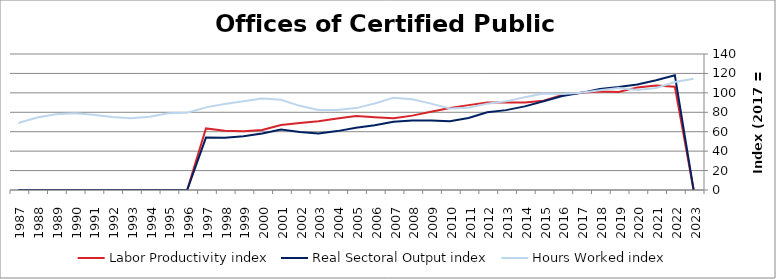
| Category | Labor Productivity index | Real Sectoral Output index | Hours Worked index |
|---|---|---|---|
| 2023.0 | 0 | 0 | 114.622 |
| 2022.0 | 106.226 | 118.014 | 111.097 |
| 2021.0 | 107.583 | 113.073 | 105.103 |
| 2020.0 | 105.625 | 108.632 | 102.847 |
| 2019.0 | 100.869 | 106.018 | 105.105 |
| 2018.0 | 101.414 | 104.084 | 102.633 |
| 2017.0 | 100 | 100 | 100 |
| 2016.0 | 97.776 | 96.698 | 98.898 |
| 2015.0 | 91.965 | 91.276 | 99.251 |
| 2014.0 | 90.201 | 86.068 | 95.418 |
| 2013.0 | 90.118 | 82.226 | 91.242 |
| 2012.0 | 90.015 | 80.028 | 88.905 |
| 2011.0 | 87.364 | 74.038 | 84.747 |
| 2010.0 | 84.441 | 70.793 | 83.837 |
| 2009.0 | 80.536 | 71.606 | 88.913 |
| 2008.0 | 76.549 | 71.441 | 93.327 |
| 2007.0 | 73.89 | 70.236 | 95.056 |
| 2006.0 | 74.824 | 66.646 | 89.07 |
| 2005.0 | 76.099 | 64.146 | 84.292 |
| 2004.0 | 73.665 | 60.622 | 82.294 |
| 2003.0 | 70.707 | 58.185 | 82.29 |
| 2002.0 | 69.059 | 59.829 | 86.635 |
| 2001.0 | 66.935 | 62.189 | 92.91 |
| 2000.0 | 61.797 | 58.253 | 94.264 |
| 1999.0 | 60.562 | 55.299 | 91.31 |
| 1998.0 | 60.905 | 53.854 | 88.422 |
| 1997.0 | 63.407 | 53.922 | 85.041 |
| 1996.0 | 0 | 0 | 79.461 |
| 1995.0 | 0 | 0 | 78.964 |
| 1994.0 | 0 | 0 | 75.452 |
| 1993.0 | 0 | 0 | 73.748 |
| 1992.0 | 0 | 0 | 75.198 |
| 1991.0 | 0 | 0 | 77.349 |
| 1990.0 | 0 | 0 | 78.962 |
| 1989.0 | 0 | 0 | 77.965 |
| 1988.0 | 0 | 0 | 74.607 |
| 1987.0 | 0 | 0 | 68.924 |